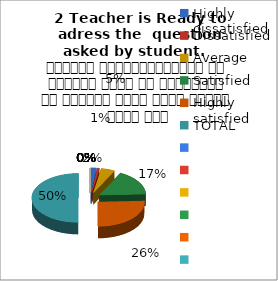
| Category | 2 Teacher is Ready to adress the  question asked by student.   शिक्षक विद्यार्थियों के द्वारा पूछे गए प्रश्नों का समाधान करने हेतु तत्पर रहते हैं |
|---|---|
| Highly dissatisfied | 3 |
| Dissatisfied | 1 |
| Average | 7 |
| Satisfied | 25 |
| Highly satisfied | 38 |
| TOTAL | 74 |